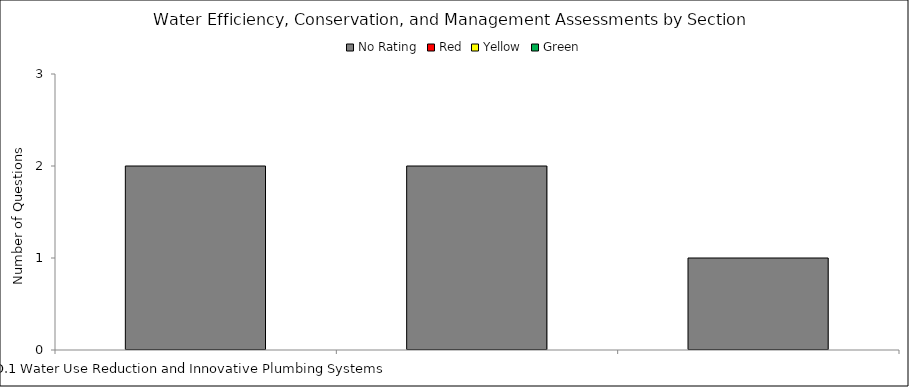
| Category | No Rating | Red | Yellow | Green |
|---|---|---|---|---|
| D.1 Water Use Reduction and Innovative Plumbing Systems | 2 | 0 | 0 | 0 |
| D.2 Innovative Wastewater Treatment | 2 | 0 | 0 | 0 |
| D.3 Water-Efficient Landscaping and Landscape Irrigation | 1 | 0 | 0 | 0 |